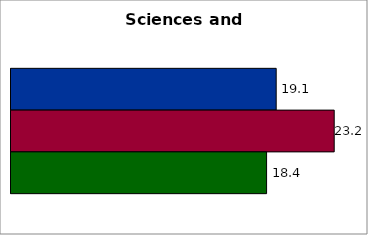
| Category | 50 states and D.C. | SREB states | State |
|---|---|---|---|
| 0 | 19.051 | 23.219 | 18.361 |